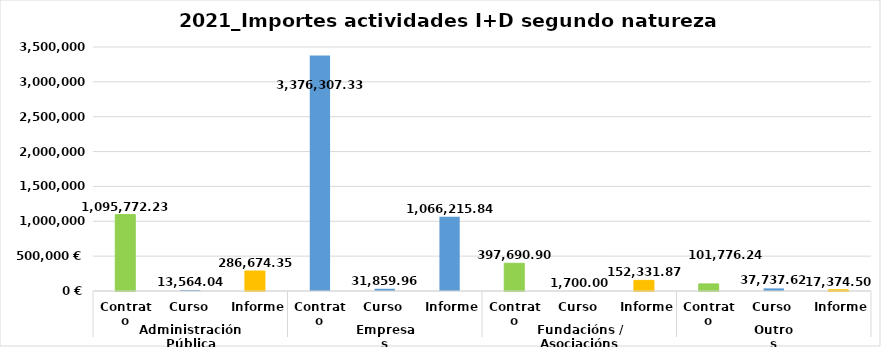
| Category | Series 0 |
|---|---|
| 0 | 1095772.23 |
| 1 | 13564.04 |
| 2 | 286674.35 |
| 3 | 3376307.33 |
| 4 | 31859.96 |
| 5 | 1066215.84 |
| 6 | 397690.9 |
| 7 | 1700 |
| 8 | 152331.87 |
| 9 | 101776.24 |
| 10 | 37737.62 |
| 11 | 17374.5 |